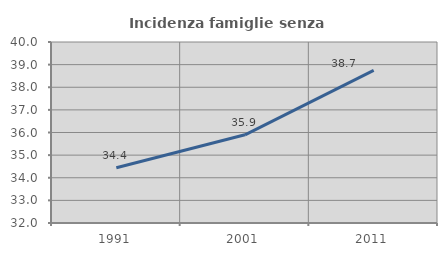
| Category | Incidenza famiglie senza nuclei |
|---|---|
| 1991.0 | 34.439 |
| 2001.0 | 35.897 |
| 2011.0 | 38.743 |